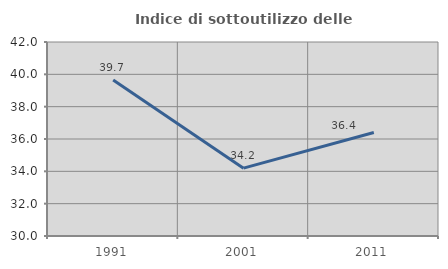
| Category | Indice di sottoutilizzo delle abitazioni  |
|---|---|
| 1991.0 | 39.655 |
| 2001.0 | 34.197 |
| 2011.0 | 36.4 |